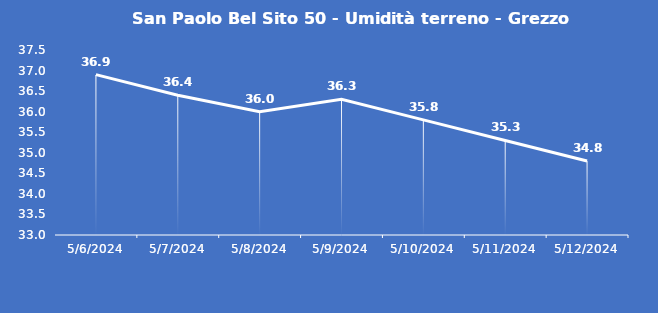
| Category | San Paolo Bel Sito 50 - Umidità terreno - Grezzo (%VWC) |
|---|---|
| 5/6/24 | 36.9 |
| 5/7/24 | 36.4 |
| 5/8/24 | 36 |
| 5/9/24 | 36.3 |
| 5/10/24 | 35.8 |
| 5/11/24 | 35.3 |
| 5/12/24 | 34.8 |